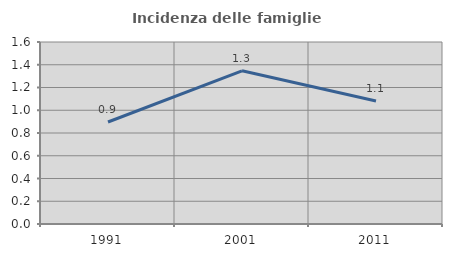
| Category | Incidenza delle famiglie numerose |
|---|---|
| 1991.0 | 0.897 |
| 2001.0 | 1.347 |
| 2011.0 | 1.081 |